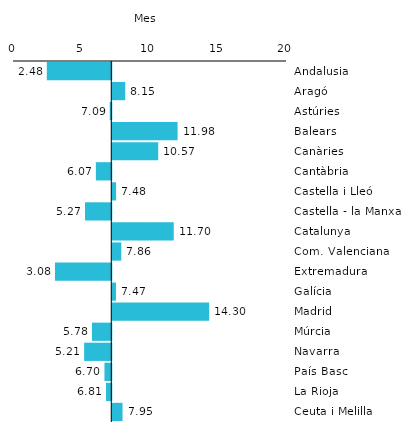
| Category | Series 0 |
|---|---|
| Andalusia | 2.476 |
| Aragó | 8.15 |
| Astúries | 7.089 |
| Balears | 11.984 |
| Canàries | 10.565 |
| Cantàbria | 6.071 |
| Castella i Lleó | 7.479 |
| Castella - la Manxa | 5.274 |
| Catalunya | 11.702 |
| Com. Valenciana | 7.861 |
| Extremadura | 3.075 |
| Galícia | 7.47 |
| Madrid | 14.298 |
| Múrcia | 5.784 |
| Navarra | 5.213 |
| País Basc | 6.699 |
| La Rioja | 6.811 |
| Ceuta i Melilla | 7.95 |